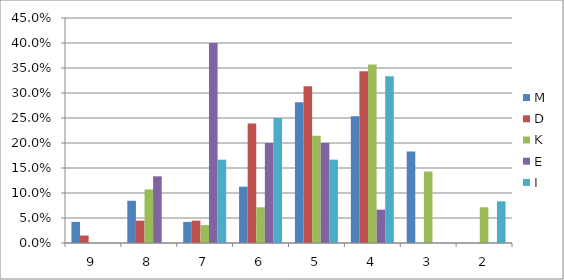
| Category | M | D | K | E | I | R |
|---|---|---|---|---|---|---|
| 9.0 | 0.042 | 0.015 | 0 | 0 | 0 |  |
| 8.0 | 0.085 | 0.045 | 0.107 | 0.133 | 0 |  |
| 7.0 | 0.042 | 0.045 | 0.036 | 0.4 | 0.167 |  |
| 6.0 | 0.113 | 0.239 | 0.071 | 0.2 | 0.25 |  |
| 5.0 | 0.282 | 0.313 | 0.214 | 0.2 | 0.167 |  |
| 4.0 | 0.254 | 0.343 | 0.357 | 0.067 | 0.333 |  |
| 3.0 | 0.183 | 0 | 0.143 | 0 | 0 |  |
| 2.0 | 0 | 0 | 0.071 | 0 | 0.083 |  |